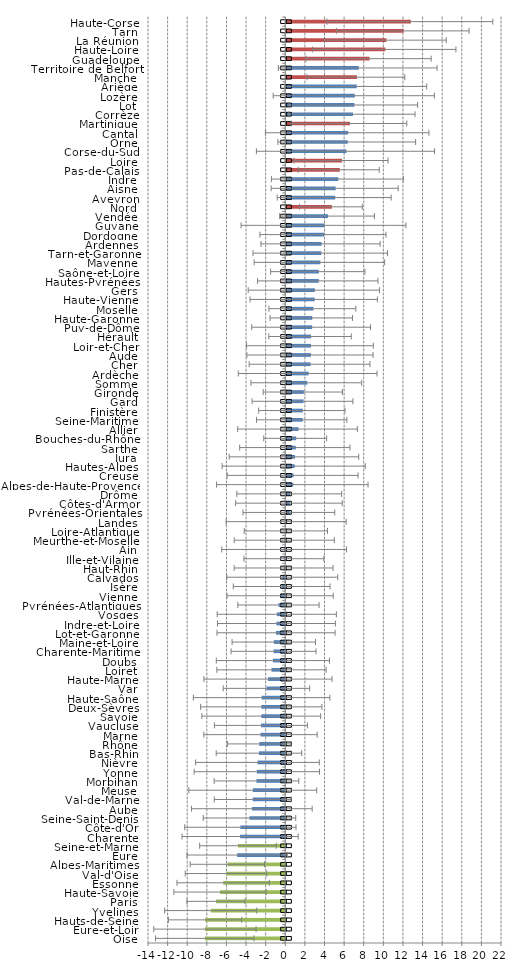
| Category | Series 0 | IC nation1 | IC natio 2 |
|---|---|---|---|
| Oise | -8.21 | 0.522 | -0.522 |
| Eure-et-Loir | -8.196 | 0.522 | -0.522 |
| Hauts-de-Seine | -8.182 | 0.522 | -0.522 |
| Yvelines | -7.607 | 0.522 | -0.522 |
| Paris | -7.066 | 0.522 | -0.522 |
| Haute-Savoie | -6.656 | 0.522 | -0.522 |
| Essonne | -6.333 | 0.522 | -0.522 |
| Val-d'Oise | -6.047 | 0.522 | -0.522 |
| Alpes-Maritimes | -5.906 | 0.522 | -0.522 |
| Eure | -4.911 | 0.522 | -0.522 |
| Seine-et-Marne | -4.826 | 0.522 | -0.522 |
| Charente | -4.608 | 0.522 | -0.522 |
| Côte-d'Or | -4.58 | 0.522 | -0.522 |
| Seine-Saint-Denis | -3.649 | 0.522 | -0.522 |
| Aube | -3.409 | 0.522 | -0.522 |
| Val-de-Marne | -3.321 | 0.522 | -0.522 |
| Meuse | -3.314 | 0.522 | -0.522 |
| Morbihan | -2.941 | 0.522 | -0.522 |
| Yonne | -2.904 | 0.522 | -0.522 |
| Nièvre | -2.836 | 0.522 | -0.522 |
| Bas-Rhin | -2.683 | 0.522 | -0.522 |
| Rhône | -2.659 | 0.522 | -0.522 |
| Marne | -2.529 | 0.522 | -0.522 |
| Vaucluse | -2.485 | 0.522 | -0.522 |
| Savoie | -2.45 | 0.522 | -0.522 |
| Deux-Sèvres | -2.447 | 0.522 | -0.522 |
| Haute-Saône | -2.414 | 0.522 | -0.522 |
| Var | -1.919 | 0.522 | -0.522 |
| Haute-Marne | -1.765 | 0.522 | -0.522 |
| Loiret | -1.404 | 0.522 | -0.522 |
| Doubs | -1.265 | 0.522 | -0.522 |
| Charente-Maritime | -1.2 | 0.522 | -0.522 |
| Maine-et-Loire | -1.172 | 0.522 | -0.522 |
| Lot-et-Garonne | -0.942 | 0.522 | -0.522 |
| Indre-et-Loire | -0.904 | 0.522 | -0.522 |
| Vosges | -0.867 | 0.522 | -0.522 |
| Pyrénées-Atlantiques | -0.696 | 0.522 | -0.522 |
| Vienne | -0.526 | 0.522 | -0.522 |
| Isère | -0.368 | 0.522 | -0.522 |
| Calvados | -0.303 | 0.522 | -0.522 |
| Haut-Rhin | -0.173 | 0.522 | -0.522 |
| Ille-et-Vilaine | -0.14 | 0.522 | -0.522 |
| Ain | -0.12 | 0.522 | -0.522 |
| Meurthe-et-Moselle | -0.102 | 0.522 | -0.522 |
| Loire-Atlantique | 0.058 | 0.522 | -0.522 |
| Landes | 0.089 | 0.522 | -0.522 |
| Pyrénées-Orientales | 0.364 | 0.522 | -0.522 |
| Côtes-d'Armor | 0.371 | 0.522 | -0.522 |
| Drôme | 0.404 | 0.522 | -0.522 |
| Alpes-de-Haute-Provence | 0.716 | 0.522 | -0.522 |
| Creuse | 0.751 | 0.522 | -0.522 |
| Hautes-Alpes | 0.858 | 0.522 | -0.522 |
| Jura | 0.888 | 0.522 | -0.522 |
| Sarthe | 0.974 | 0.522 | -0.522 |
| Bouches-du-Rhône | 1.013 | 0.522 | -0.522 |
| Allier | 1.251 | 0.522 | -0.522 |
| Seine-Maritime | 1.673 | 0.522 | -0.522 |
| Finistère | 1.689 | 0.522 | -0.522 |
| Gard | 1.756 | 0.522 | -0.522 |
| Gironde | 1.791 | 0.522 | -0.522 |
| Somme | 2.145 | 0.522 | -0.522 |
| Ardèche | 2.281 | 0.522 | -0.522 |
| Cher | 2.475 | 0.522 | -0.522 |
| Aude | 2.513 | 0.522 | -0.522 |
| Loir-et-Cher | 2.515 | 0.522 | -0.522 |
| Hérault | 2.526 | 0.522 | -0.522 |
| Puy-de-Dôme | 2.64 | 0.522 | -0.522 |
| Haute-Garonne | 2.649 | 0.522 | -0.522 |
| Moselle | 2.765 | 0.522 | -0.522 |
| Haute-Vienne | 2.899 | 0.522 | -0.522 |
| Gers | 2.915 | 0.522 | -0.522 |
| Hautes-Pyrénées | 3.313 | 0.522 | -0.522 |
| Saône-et-Loire | 3.317 | 0.522 | -0.522 |
| Mayenne | 3.479 | 0.522 | -0.522 |
| Tarn-et-Garonne | 3.566 | 0.522 | -0.522 |
| Ardennes | 3.595 | 0.522 | -0.522 |
| Dordogne | 3.844 | 0.522 | -0.522 |
| Guyane | 3.897 | 0.522 | -0.522 |
| Vendée | 4.261 | 0.522 | -0.522 |
| Nord | 4.647 | 0.522 | -0.522 |
| Aveyron | 4.987 | 0.522 | -0.522 |
| Aisne | 5.036 | 0.522 | -0.522 |
| Indre | 5.316 | 0.522 | -0.522 |
| Pas-de-Calais | 5.455 | 0.522 | -0.522 |
| Loire | 5.684 | 0.522 | -0.522 |
| Corse-du-Sud | 6.141 | 0.522 | -0.522 |
| Orne | 6.27 | 0.522 | -0.522 |
| Cantal | 6.311 | 0.522 | -0.522 |
| Martinique | 6.495 | 0.522 | -0.522 |
| Corrèze | 6.802 | 0.522 | -0.522 |
| Lot | 6.95 | 0.522 | -0.522 |
| Lozère | 6.988 | 0.522 | -0.522 |
| Ariège | 7.182 | 0.522 | -0.522 |
| Manche | 7.202 | 0.522 | -0.522 |
| Territoire de Belfort | 7.388 | 0.522 | -0.522 |
| Guadeloupe | 8.496 | 0.522 | -0.522 |
| Haute-Loire | 10.099 | 0.522 | -0.522 |
| La Réunion | 10.21 | 0.522 | -0.522 |
| Tarn | 11.977 | 0.522 | -0.522 |
| Haute-Corse | 12.705 | 0.522 | -0.522 |